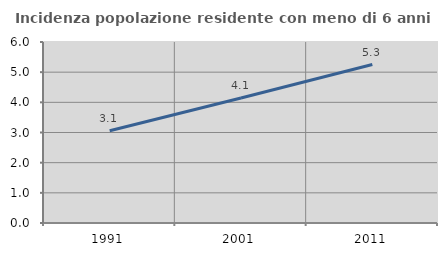
| Category | Incidenza popolazione residente con meno di 6 anni |
|---|---|
| 1991.0 | 3.057 |
| 2001.0 | 4.145 |
| 2011.0 | 5.253 |